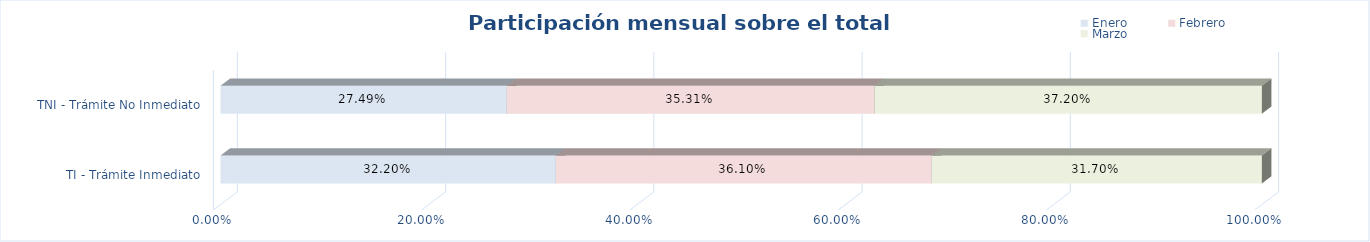
| Category | Enero | Febrero | Marzo |
|---|---|---|---|
| TI - Trámite Inmediato | 0.322 | 0.361 | 0.317 |
| TNI - Trámite No Inmediato | 0.275 | 0.353 | 0.372 |